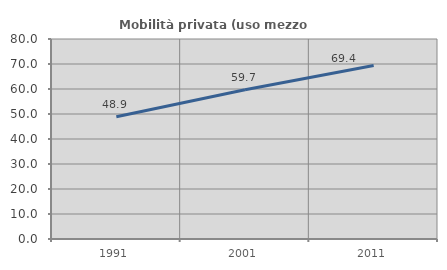
| Category | Mobilità privata (uso mezzo privato) |
|---|---|
| 1991.0 | 48.9 |
| 2001.0 | 59.734 |
| 2011.0 | 69.374 |